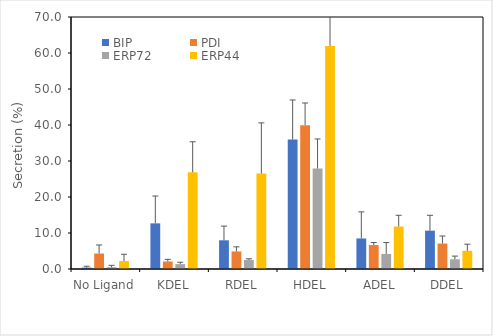
| Category | BIP | PDI | ERP72 | ERP44 |
|---|---|---|---|---|
| No Ligand | 0.385 | 4.303 | 0.508 | 2.202 |
| KDEL | 12.676 | 2.097 | 1.348 | 26.861 |
| RDEL | 7.974 | 4.883 | 2.53 | 26.517 |
| HDEL | 35.961 | 39.956 | 27.909 | 61.968 |
| ADEL | 8.487 | 6.649 | 4.177 | 11.791 |
| DDEL | 10.651 | 7.07 | 2.692 | 5.069 |